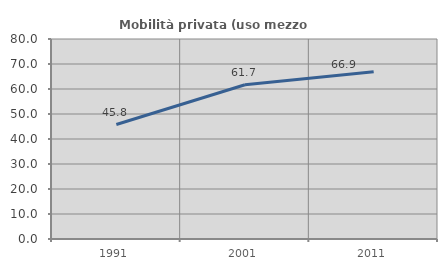
| Category | Mobilità privata (uso mezzo privato) |
|---|---|
| 1991.0 | 45.788 |
| 2001.0 | 61.688 |
| 2011.0 | 66.881 |